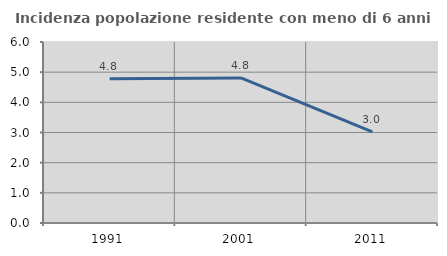
| Category | Incidenza popolazione residente con meno di 6 anni |
|---|---|
| 1991.0 | 4.783 |
| 2001.0 | 4.808 |
| 2011.0 | 3.018 |